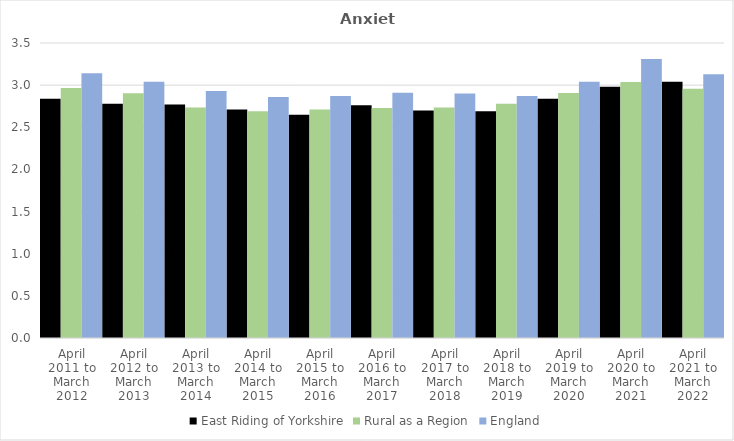
| Category | East Riding of Yorkshire | Rural as a Region | England |
|---|---|---|---|
| April 2011 to March 2012 | 2.84 | 2.967 | 3.14 |
| April 2012 to March 2013 | 2.78 | 2.904 | 3.04 |
| April 2013 to March 2014 | 2.77 | 2.734 | 2.93 |
| April 2014 to March 2015 | 2.71 | 2.691 | 2.86 |
| April 2015 to March 2016 | 2.65 | 2.711 | 2.87 |
| April 2016 to March 2017 | 2.76 | 2.729 | 2.91 |
| April 2017 to March 2018 | 2.7 | 2.736 | 2.9 |
| April 2018 to March 2019 | 2.69 | 2.78 | 2.87 |
| April 2019 to March 2020 | 2.84 | 2.908 | 3.04 |
| April 2020 to March 2021 | 2.98 | 3.036 | 3.31 |
| April 2021 to March 2022 | 3.04 | 2.956 | 3.13 |